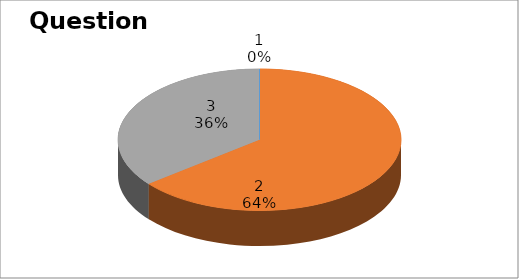
| Category | Series 0 |
|---|---|
| 0 | 0 |
| 1 | 9 |
| 2 | 5 |